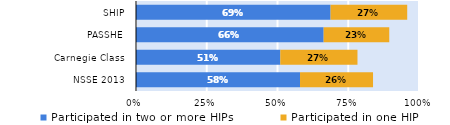
| Category | Participated in two or more HIPs | Participated in one HIP |
|---|---|---|
| NSSE 2013 | 0.58 | 0.258 |
| Carnegie Class | 0.51 | 0.273 |
| PASSHE | 0.663 | 0.232 |
| SHIP | 0.688 | 0.271 |